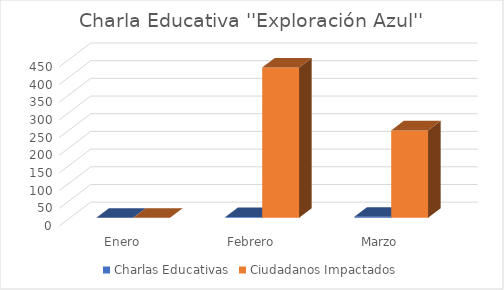
| Category | Charlas Educativas | Ciudadanos Impactados |
|---|---|---|
| Enero | 0 | 0 |
| Febrero | 2 | 425 |
| Marzo | 3 | 247 |